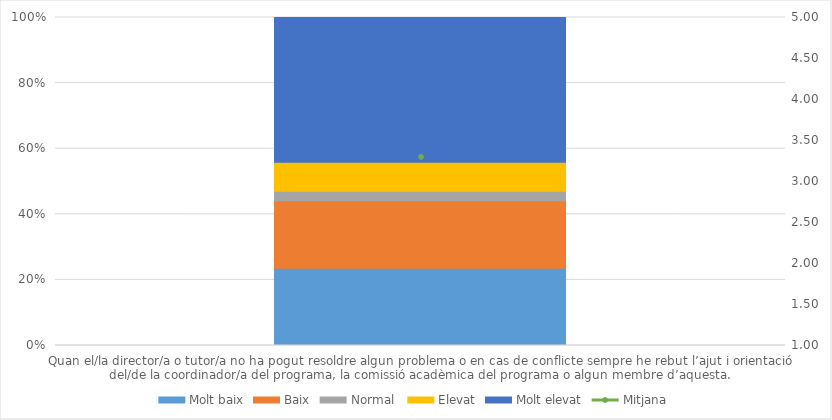
| Category | Molt baix | Baix | Normal  | Elevat | Molt elevat |
|---|---|---|---|---|---|
| Quan el/la director/a o tutor/a no ha pogut resoldre algun problema o en cas de conflicte sempre he rebut l’ajut i orientació del/de la coordinador/a del programa, la comissió acadèmica del programa o algun membre d’aquesta. | 8 | 7 | 1 | 3 | 15 |